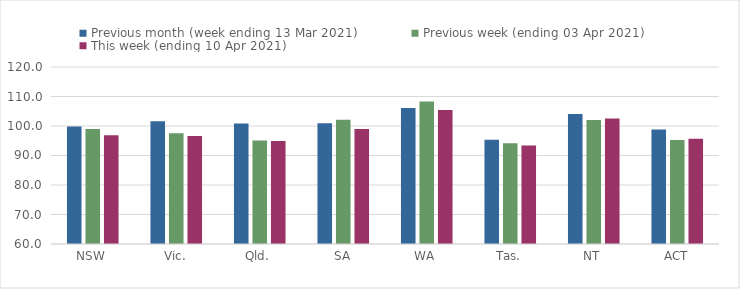
| Category | Previous month (week ending 13 Mar 2021) | Previous week (ending 03 Apr 2021) | This week (ending 10 Apr 2021) |
|---|---|---|---|
| NSW | 99.81 | 98.99 | 96.86 |
| Vic. | 101.62 | 97.55 | 96.62 |
| Qld. | 100.84 | 95.09 | 94.92 |
| SA | 100.9 | 102.12 | 98.95 |
| WA | 106.11 | 108.29 | 105.43 |
| Tas. | 95.33 | 94.17 | 93.35 |
| NT | 104.03 | 102.02 | 102.51 |
| ACT | 98.78 | 95.26 | 95.7 |